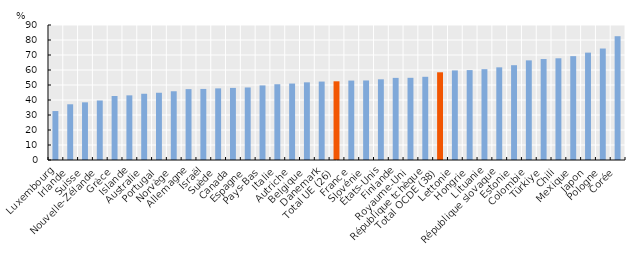
| Category | Series 3 |
|---|---|
| Luxembourg | 32.631 |
| Irlande | 37.153 |
| Suisse | 38.44 |
| Nouvelle-Zélande | 39.678 |
| Grèce | 42.672 |
| Islande | 43.096 |
| Australie | 44.162 |
| Portugal | 44.834 |
| Norvège | 45.826 |
| Allemagne | 47.259 |
| Israël | 47.371 |
| Suède | 47.75 |
| Canada | 48.07 |
| Espagne | 48.353 |
| Pays-Bas | 49.722 |
| Italie | 50.516 |
| Autriche | 50.972 |
| Belgique | 51.778 |
| Danemark | 52.285 |
| Total UE (26) | 52.466 |
| France | 52.961 |
| Slovénie | 53.02 |
| États-Unis | 53.798 |
| Finlande | 54.746 |
| Royaume-Uni | 54.797 |
| République tchèque | 55.468 |
| Total OCDE (38) | 58.471 |
| Lettonie | 59.72 |
| Hongrie | 59.932 |
| Lituanie | 60.548 |
| République slovaque | 61.773 |
| Estonie | 63.205 |
| Colombie | 66.424 |
| Türkiye | 67.31 |
| Chili | 67.805 |
| Mexique | 69.243 |
| Japon | 71.581 |
| Pologne | 74.318 |
| Corée | 82.53 |